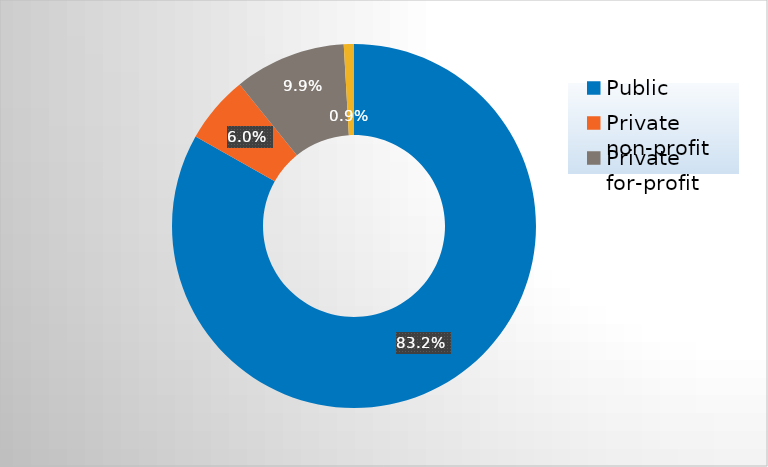
| Category | Series 0 |
|---|---|
| Public | 0.832 |
| Private non-profit | 0.06 |
| Private for-profit | 0.099 |
| Other | 0.009 |